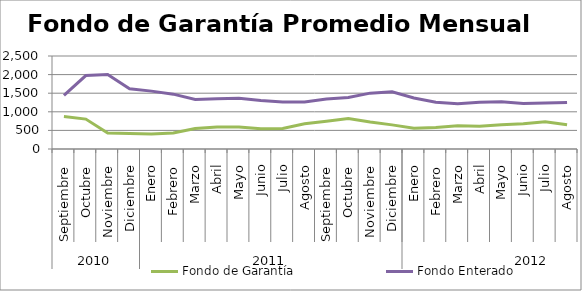
| Category | Fondo de Garantía | Fondo Enterado |
|---|---|---|
| 0 | 871.43 | 1439.553 |
| 1 | 804.208 | 1973.732 |
| 2 | 428.758 | 2004.096 |
| 3 | 417.974 | 1620.905 |
| 4 | 403.651 | 1555.632 |
| 5 | 429.02 | 1474.054 |
| 6 | 551.344 | 1328.521 |
| 7 | 591.732 | 1351.463 |
| 8 | 591.784 | 1363.301 |
| 9 | 544.875 | 1304.985 |
| 10 | 551.606 | 1265.502 |
| 11 | 679.839 | 1266.018 |
| 12 | 747.74 | 1344.929 |
| 13 | 819.75 | 1383.171 |
| 14 | 723.635 | 1501.378 |
| 15 | 648.288 | 1537.485 |
| 16 | 560.173 | 1370.992 |
| 17 | 575.916 | 1258.831 |
| 18 | 622.075 | 1216.471 |
| 19 | 612.299 | 1258.963 |
| 20 | 654.277 | 1273.362 |
| 21 | 675.965 | 1225.977 |
| 22 | 729.97 | 1235.91 |
| 23 | 649.095 | 1253.333 |